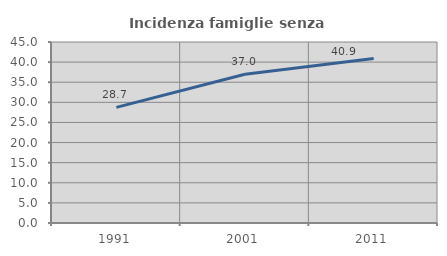
| Category | Incidenza famiglie senza nuclei |
|---|---|
| 1991.0 | 28.736 |
| 2001.0 | 36.973 |
| 2011.0 | 40.889 |